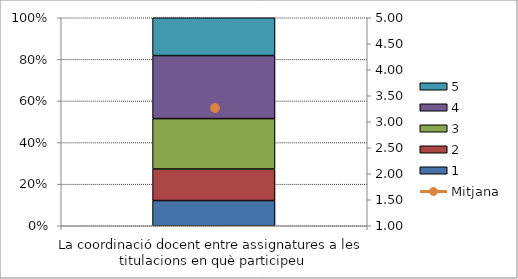
| Category | 1 | 2 | 3 | 4 | 5 |
|---|---|---|---|---|---|
| La coordinació docent entre assignatures a les titulacions en què participeu | 4 | 5 | 8 | 10 | 6 |